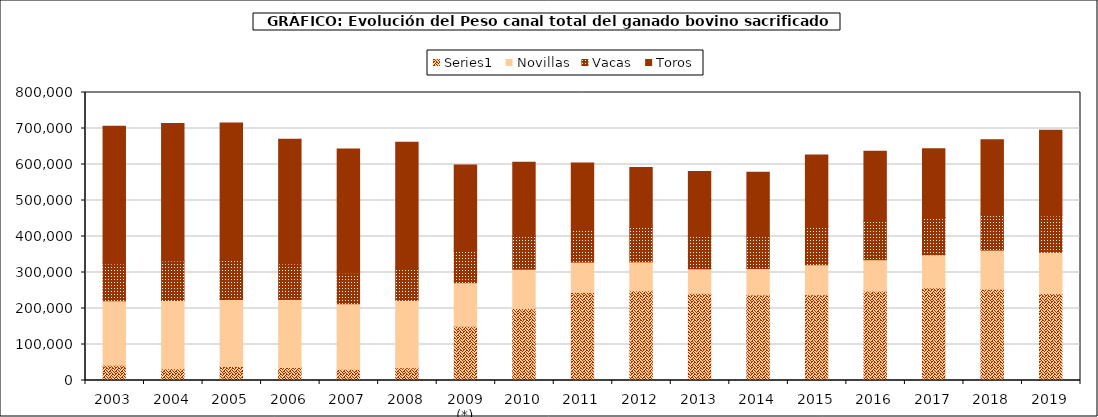
| Category | Series 0 | Novillas | Vacas | Toros |
|---|---|---|---|---|
| 2003 | 42608 | 178849.967 | 102375.937 | 382535.472 |
| 2004 | 32509.696 | 189629.471 | 110072.96 | 381674.199 |
| 2005 | 38749.36 | 186497.831 | 110798.423 | 379285.221 |
| 2006 | 36032.274 | 189084.616 | 98804.791 | 346485.954 |
| 2007 | 31445.341 | 181838.873 | 84917.657 | 344965.587 |
| 2008 | 35627.401 | 186852.322 | 89884.28 | 349367.497 |
| 2009 (*) | 150694.983 | 121013.078 | 87398.819 | 239318.172 |
| 2010 | 199955.359 | 109158.53 | 90751.469 | 206730.181 |
| 2011 | 244730.574 | 84120.636 | 91909.223 | 183351.72 |
| 2012 | 249278.477 | 80252.629 | 95185.691 | 166603.472 |
| 2013 | 242186.585 | 68048.006 | 90078.606 | 180527.091 |
| 2014 | 237629.148 | 73287.378 | 90109.546 | 177574.131 |
| 2015 | 238108.353 | 83104.642 | 104715.455 | 200175.588 |
| 2016 | 248376.799 | 87111.714 | 108065.349 | 193458.873 |
| 2017 | 257454.509 | 91771.511 | 103786.006 | 190848.614 |
| 2018 | 253487.765 | 108585.18 | 101489.485 | 205445.855 |
| 2019 | 241801.487 | 114400.697 | 101022.723 | 237938.359 |